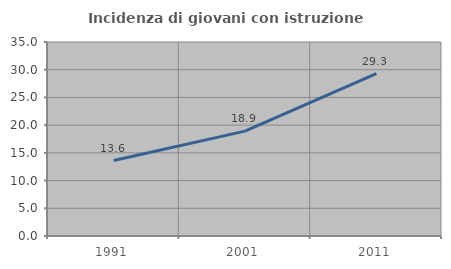
| Category | Incidenza di giovani con istruzione universitaria |
|---|---|
| 1991.0 | 13.615 |
| 2001.0 | 18.924 |
| 2011.0 | 29.316 |